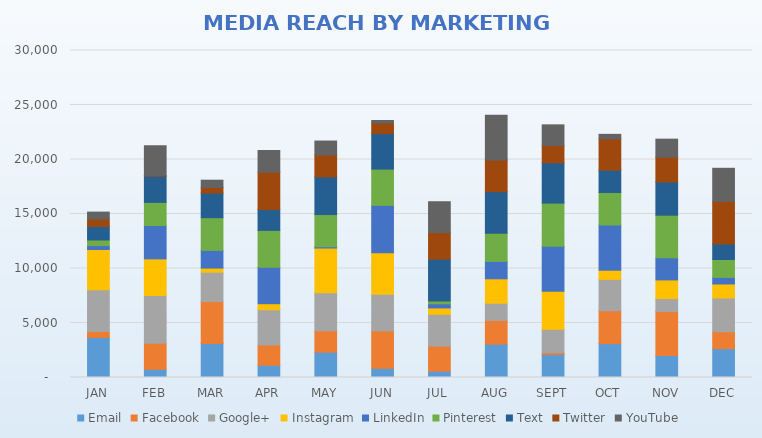
| Category | Email | Facebook | Google+ | Instagram | LinkedIn | Pinterest | Text | Twitter | YouTube |
|---|---|---|---|---|---|---|---|---|---|
| JAN | 3675 | 534 | 3839 | 3694 | 357 | 516 | 1244 | 677 | 639 |
| FEB | 753 | 2387 | 4384 | 3360 | 3059 | 2122 | 2409 | 38 | 2750 |
| MAR | 3126 | 3839 | 2694 | 379 | 1625 | 2998 | 2259 | 509 | 672 |
| APR | 1121 | 1860 | 3239 | 550 | 3345 | 3381 | 1918 | 3421 | 1993 |
| MAY | 2326 | 1953 | 3491 | 4107 | 112 | 2958 | 3455 | 2011 | 1281 |
| JUN | 842 | 3439 | 3346 | 3825 | 4338 | 3327 | 3258 | 976 | 226 |
| JUL | 578 | 2307 | 2914 | 581 | 383 | 257 | 3838 | 2435 | 2832 |
| AUG | 3060 | 2181 | 1571 | 2245 | 1591 | 2581 | 3819 | 2917 | 4100 |
| SEPT | 2118 | 155 | 2148 | 3496 | 4116 | 3967 | 3695 | 1590 | 1894 |
| OCT | 3106 | 3017 | 2876 | 830 | 4165 | 2981 | 2047 | 2875 | 410 |
| NOV | 2012 | 4035 | 1192 | 1714 | 2027 | 3910 | 3048 | 2282 | 1647 |
| DEC | 2644 | 1552 | 3097 | 1286 | 602 | 1643 | 1431 | 3900 | 3038 |